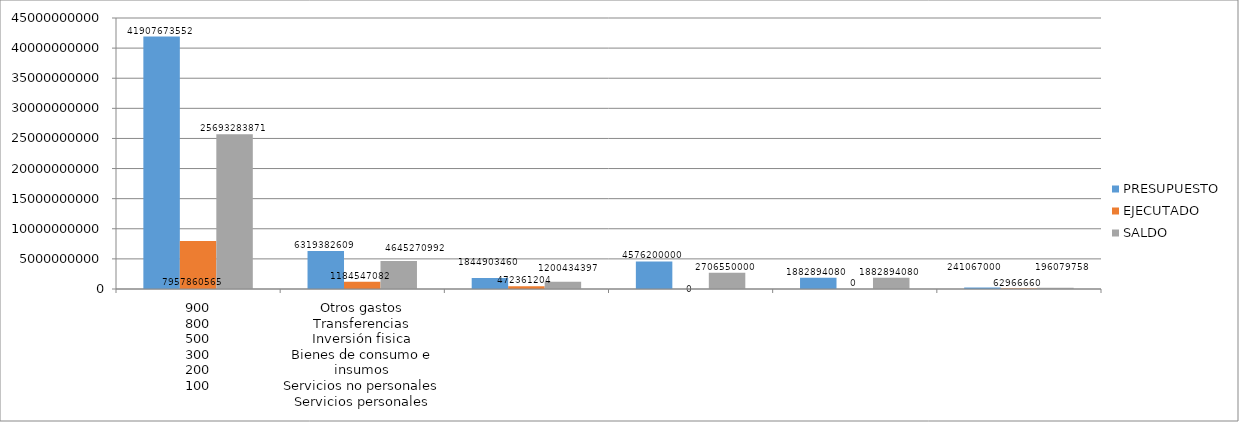
| Category | PRESUPUESTO | EJECUTADO | SALDO |
|---|---|---|---|
| 0 | 41907673552 | 7957860565 | 25693283871 |
| 1 | 6319382609 | 1184547082 | 4645270992 |
| 2 | 1844903460 | 472361204 | 1200434397 |
| 3 | 4576200000 | 0 | 2706550000 |
| 4 | 1882894080 | 0 | 1882894080 |
| 5 | 241067000 | 62966660 | 196079758 |